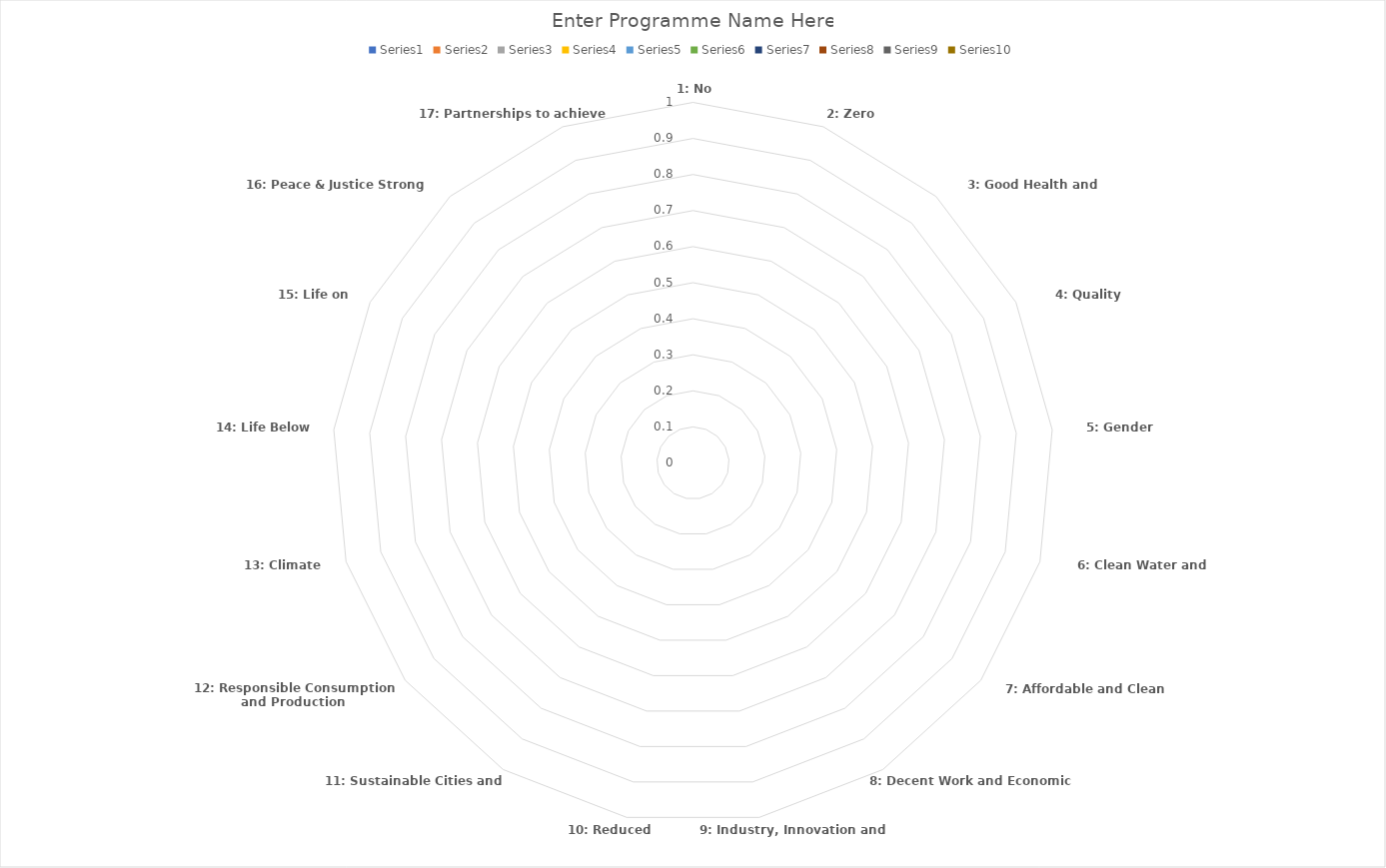
| Category | Series 0 | Series 1 | Series 2 | Series 3 | Series 4 | Series 5 | Series 6 | Series 7 | Series 8 | Series 9 |
|---|---|---|---|---|---|---|---|---|---|---|
|  1: No Poverty | 0 | 0 | 0 | 0 | 0 | 0 | 0 | 0 | 0 | 0 |
|  2: Zero Hunger | 0 | 0 | 0 | 0 | 0 | 0 | 0 | 0 | 0 | 0 |
|  3: Good Health and Well-being | 0 | 0 | 0 | 0 | 0 | 0 | 0 | 0 | 0 | 0 |
|  4: Quality Education | 0 | 0 | 0 | 0 | 0 | 0 | 0 | 0 | 0 | 0 |
|  5: Gender Equality | 0 | 0 | 0 | 0 | 0 | 0 | 0 | 0 | 0 | 0 |
|  6: Clean Water and Sanitation | 0 | 0 | 0 | 0 | 0 | 0 | 0 | 0 | 0 | 0 |
|  7: Affordable and Clean Energy | 0 | 0 | 0 | 0 | 0 | 0 | 0 | 0 | 0 | 0 |
|  8: Decent Work and Economic Growth | 0 | 0 | 0 | 0 | 0 | 0 | 0 | 0 | 0 | 0 |
|  9: Industry, Innovation and Infrastructure | 0 | 0 | 0 | 0 | 0 | 0 | 0 | 0 | 0 | 0 |
|  10: Reduced Inequality | 0 | 0 | 0 | 0 | 0 | 0 | 0 | 0 | 0 | 0 |
|  11: Sustainable Cities and Communities | 0 | 0 | 0 | 0 | 0 | 0 | 0 | 0 | 0 | 0 |
|  12: Responsible Consumption and Production | 0 | 0 | 0 | 0 | 0 | 0 | 0 | 0 | 0 | 0 |
|  13: Climate Action | 0 | 0 | 0 | 0 | 0 | 0 | 0 | 0 | 0 | 0 |
|  14: Life Below Water | 0 | 0 | 0 | 0 | 0 | 0 | 0 | 0 | 0 | 0 |
|  15: Life on Land | 0 | 0 | 0 | 0 | 0 | 0 | 0 | 0 | 0 | 0 |
|  16: Peace & Justice Strong Institutions | 0 | 0 | 0 | 0 | 0 | 0 | 0 | 0 | 0 | 0 |
|  17: Partnerships to achieve SDGs  | 0 | 0 | 0 | 0 | 0 | 0 | 0 | 0 | 0 | 0 |